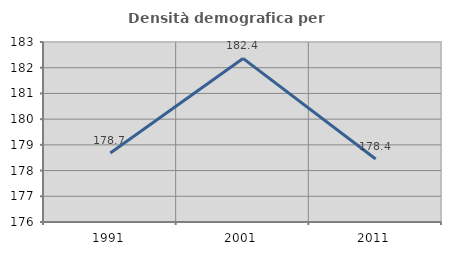
| Category | Densità demografica |
|---|---|
| 1991.0 | 178.685 |
| 2001.0 | 182.361 |
| 2011.0 | 178.448 |